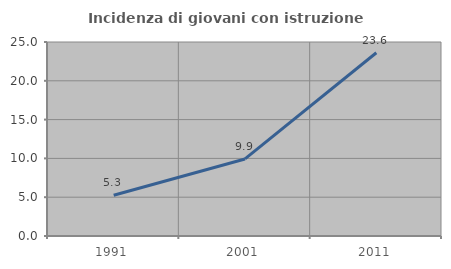
| Category | Incidenza di giovani con istruzione universitaria |
|---|---|
| 1991.0 | 5.254 |
| 2001.0 | 9.929 |
| 2011.0 | 23.617 |